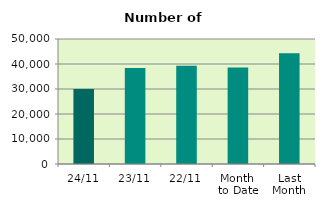
| Category | Series 0 |
|---|---|
| 24/11 | 29974 |
| 23/11 | 38450 |
| 22/11 | 39300 |
| Month 
to Date | 38550.889 |
| Last
Month | 44266.476 |